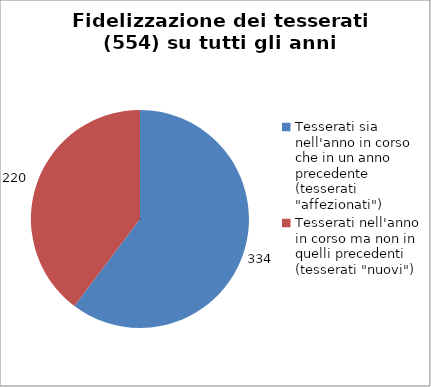
| Category | Nr. Tesserati |
|---|---|
| Tesserati sia nell'anno in corso che in un anno precedente (tesserati "affezionati") | 334 |
| Tesserati nell'anno in corso ma non in quelli precedenti (tesserati "nuovi") | 220 |